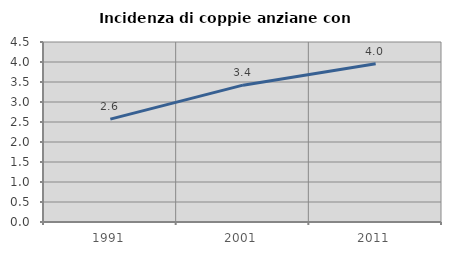
| Category | Incidenza di coppie anziane con figli |
|---|---|
| 1991.0 | 2.573 |
| 2001.0 | 3.421 |
| 2011.0 | 3.956 |